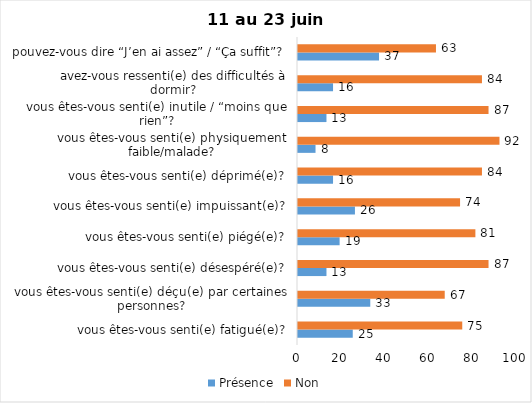
| Category | Présence | Non |
|---|---|---|
| vous êtes-vous senti(e) fatigué(e)? | 25 | 75 |
| vous êtes-vous senti(e) déçu(e) par certaines personnes? | 33 | 67 |
| vous êtes-vous senti(e) désespéré(e)? | 13 | 87 |
| vous êtes-vous senti(e) piégé(e)? | 19 | 81 |
| vous êtes-vous senti(e) impuissant(e)? | 26 | 74 |
| vous êtes-vous senti(e) déprimé(e)? | 16 | 84 |
| vous êtes-vous senti(e) physiquement faible/malade? | 8 | 92 |
| vous êtes-vous senti(e) inutile / “moins que rien”? | 13 | 87 |
| avez-vous ressenti(e) des difficultés à dormir? | 16 | 84 |
| pouvez-vous dire “J’en ai assez” / “Ça suffit”? | 37 | 63 |